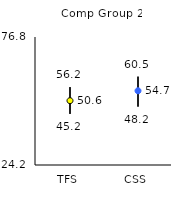
| Category | 25th | 75th | Mean |
|---|---|---|---|
| TFS | 45.2 | 56.2 | 50.63 |
| CSS | 48.2 | 60.5 | 54.7 |